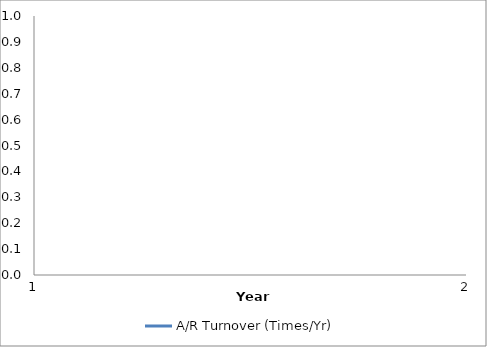
| Category | A/R Turnover (Times/Yr) |
|---|---|
| 0 | 0 |
| 1 | 0 |
| 2 | 0 |
| 3 | 0 |
| 4 | 0 |
| 5 | 0 |
| 6 | 0 |
| 7 | 0 |
| 8 | 0 |
| 9 | 0 |